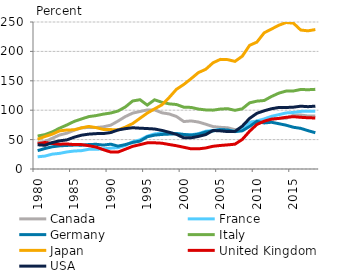
| Category | Canada | France | Germany | Italy | Japan | United Kingdom | USA |
|---|---|---|---|---|---|---|---|
| 1980.0 | 45.41 | 20.76 | 31.25 | 56.08 | 50.63 | 42.77 | 41.18 |
| 1981.0 | 46.56 | 21.97 | 34.86 | 58.46 | 55.29 | 45.09 | 40.33 |
| 1982.0 | 52.26 | 25.27 | 37.79 | 63.14 | 59.26 | 43.39 | 44.98 |
| 1983.0 | 57.84 | 26.59 | 39.38 | 69.4 | 64.83 | 42.18 | 47.85 |
| 1984.0 | 60.87 | 28.99 | 40.09 | 74.9 | 66.34 | 42.59 | 49.51 |
| 1985.0 | 65.88 | 30.58 | 40.69 | 80.9 | 66.67 | 41.54 | 54.09 |
| 1986.0 | 70.1 | 31.18 | 40.54 | 85.12 | 69.93 | 41.52 | 57.52 |
| 1987.0 | 70.55 | 33.53 | 41.6 | 89.11 | 72.46 | 39.62 | 59.28 |
| 1988.0 | 70.52 | 33.48 | 42.03 | 90.83 | 70.35 | 37.34 | 60.15 |
| 1989.0 | 71.76 | 34.27 | 40.65 | 93.31 | 67.3 | 32.81 | 60.28 |
| 1990.0 | 74.53 | 35.41 | 42.25 | 95.22 | 67.04 | 28.82 | 61.99 |
| 1991.0 | 81.54 | 36.3 | 38.89 | 98.59 | 66.49 | 28.8 | 66.37 |
| 1992.0 | 89.18 | 40.01 | 41.52 | 105.49 | 71.22 | 33.66 | 68.61 |
| 1993.0 | 95.04 | 46.3 | 45.12 | 115.66 | 77.27 | 38.53 | 70.19 |
| 1994.0 | 97.78 | 49.61 | 47.42 | 117.87 | 86.22 | 41.42 | 69.39 |
| 1995.0 | 100.4 | 55.81 | 54.82 | 108.69 | 95.07 | 44.45 | 68.8 |
| 1996.0 | 100.57 | 59.68 | 57.6 | 117.71 | 102.29 | 44.55 | 68.03 |
| 1997.0 | 95.59 | 61.1 | 58.77 | 113.43 | 109.1 | 43.87 | 65.62 |
| 1998.0 | 93.61 | 61.04 | 59.38 | 110.81 | 121.63 | 41.64 | 62.47 |
| 1999.0 | 89.27 | 60.22 | 59.96 | 109.66 | 135.61 | 39.55 | 58.88 |
| 2000.0 | 80.71 | 58.65 | 58.76 | 105.11 | 143.78 | 36.98 | 53.03 |
| 2001.0 | 81.75 | 58.16 | 57.58 | 104.73 | 153.63 | 34.3 | 53.02 |
| 2002.0 | 79.89 | 60.08 | 59.22 | 101.92 | 163.99 | 34.23 | 55.38 |
| 2003.0 | 76.18 | 64.21 | 62.92 | 100.48 | 169.57 | 35.76 | 58.52 |
| 2004.0 | 72.14 | 65.74 | 64.69 | 100.09 | 180.66 | 38.66 | 65.49 |
| 2005.0 | 70.87 | 67.21 | 66.91 | 101.94 | 186.44 | 40.01 | 64.89 |
| 2006.0 | 70.13 | 64.45 | 66.33 | 102.56 | 186 | 41.02 | 63.64 |
| 2007.0 | 66.84 | 64.4 | 63.54 | 99.78 | 183.01 | 42.21 | 64.01 |
| 2008.0 | 67.83 | 68.06 | 64.93 | 102.39 | 191.81 | 50.27 | 72.85 |
| 2009.0 | 79.28 | 79 | 72.43 | 112.52 | 210.25 | 64.2 | 86.03 |
| 2010.0 | 81.1 | 81.7 | 81 | 115.38 | 215.82 | 75.74 | 94.73 |
| 2011.0 | 81.51 | 85.21 | 78.31 | 116.5 | 231.63 | 81.32 | 98.99 |
| 2012.0 | 84.84 | 89.58 | 79.52 | 123.34 | 238.01 | 84.82 | 102.5 |
| 2013.0 | 86.08 | 92.4 | 77.06 | 129 | 244.48 | 86 | 104.62 |
| 2014.0 | 86.2 | 95.34 | 74.48 | 132.53 | 249.11 | 87.94 | 104.61 |
| 2015.0 | 91.5 | 96.14 | 70.99 | 132.71 | 247.98 | 88.98 | 105.15 |
| 2016.0 | 91.816 | 97.958 | 69.107 | 135.236 | 236.335 | 87.909 | 106.819 |
| 2017.0 | 90.093 | 98.416 | 65.19 | 134.811 | 234.988 | 87.141 | 105.988 |
| 2018.0 | 89.94 | 98.394 | 61.691 | 135.477 | 237.13 | 86.769 | 106.909 |